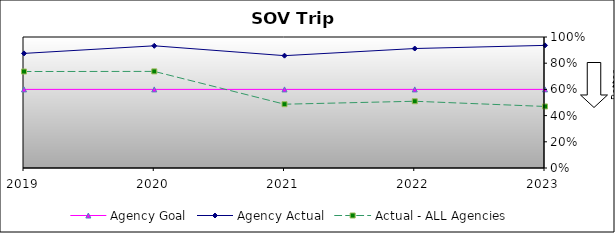
| Category | Agency Goal | Agency Actual | Actual - ALL Agencies |
|---|---|---|---|
| 2019.0 | 0.6 | 0.875 | 0.736 |
| 2020.0 | 0.6 | 0.933 | 0.737 |
| 2021.0 | 0.6 | 0.858 | 0.487 |
| 2022.0 | 0.6 | 0.912 | 0.509 |
| 2023.0 | 0.6 | 0.936 | 0.47 |